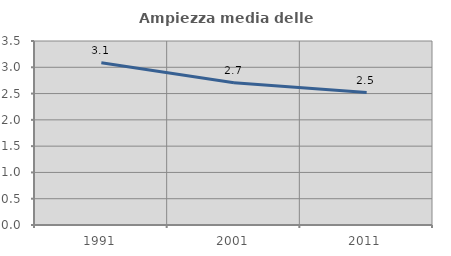
| Category | Ampiezza media delle famiglie |
|---|---|
| 1991.0 | 3.087 |
| 2001.0 | 2.707 |
| 2011.0 | 2.52 |